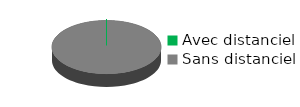
| Category | Colonne1 |
|---|---|
| Avec distanciel | 0 |
| Sans distanciel | 100 |